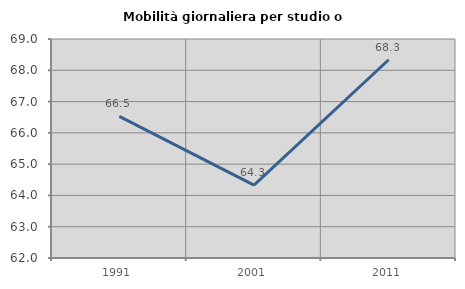
| Category | Mobilità giornaliera per studio o lavoro |
|---|---|
| 1991.0 | 66.529 |
| 2001.0 | 64.329 |
| 2011.0 | 68.337 |